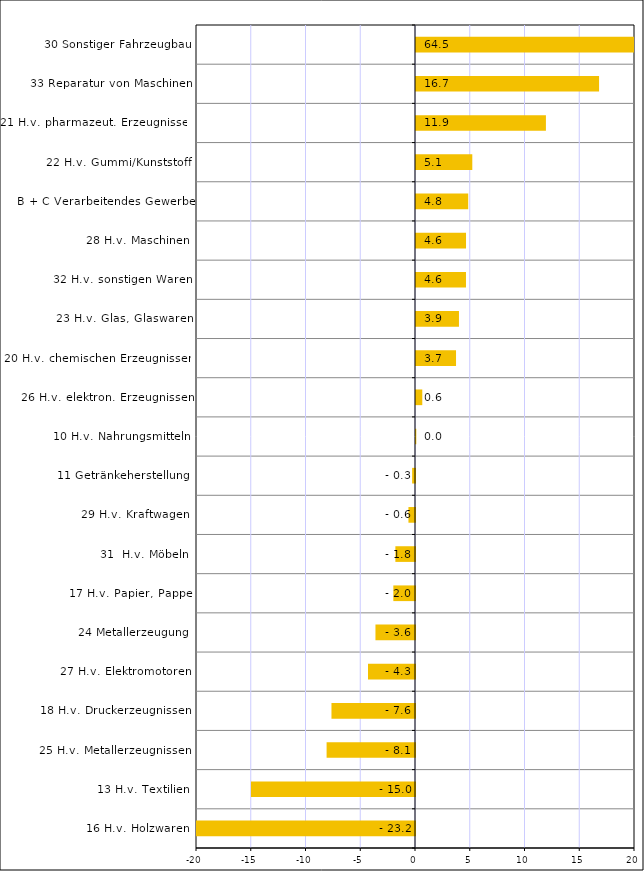
| Category | Series 0 |
|---|---|
| 16 H.v. Holzwaren | -23.224 |
| 13 H.v. Textilien | -14.979 |
| 25 H.v. Metallerzeugnissen | -8.074 |
| 18 H.v. Druckerzeugnissen | -7.628 |
| 27 H.v. Elektromotoren | -4.292 |
| 24 Metallerzeugung | -3.611 |
| 17 H.v. Papier, Pappe | -1.979 |
| 31  H.v. Möbeln | -1.792 |
| 29 H.v. Kraftwagen | -0.599 |
| 11 Getränkeherstellung | -0.262 |
| 10 H.v. Nahrungsmitteln | 0.027 |
| 26 H.v. elektron. Erzeugnissen | 0.573 |
| 20 H.v. chemischen Erzeugnissen | 3.656 |
| 23 H.v. Glas, Glaswaren | 3.923 |
| 32 H.v. sonstigen Waren | 4.564 |
| 28 H.v. Maschinen | 4.568 |
| B + C Verarbeitendes Gewerbe | 4.768 |
| 22 H.v. Gummi/Kunststoff | 5.142 |
| 21 H.v. pharmazeut. Erzeugnissen | 11.865 |
| 33 Reparatur von Maschinen | 16.718 |
| 30 Sonstiger Fahrzeugbau | 64.543 |